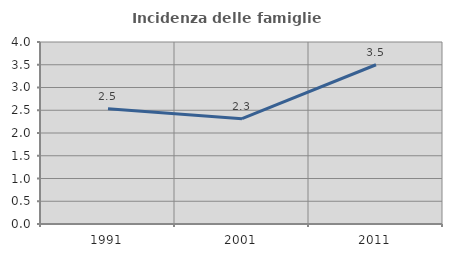
| Category | Incidenza delle famiglie numerose |
|---|---|
| 1991.0 | 2.532 |
| 2001.0 | 2.315 |
| 2011.0 | 3.5 |